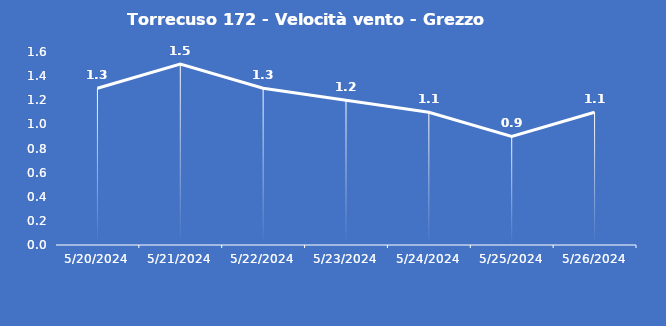
| Category | Torrecuso 172 - Velocità vento - Grezzo (m/s) |
|---|---|
| 5/20/24 | 1.3 |
| 5/21/24 | 1.5 |
| 5/22/24 | 1.3 |
| 5/23/24 | 1.2 |
| 5/24/24 | 1.1 |
| 5/25/24 | 0.9 |
| 5/26/24 | 1.1 |